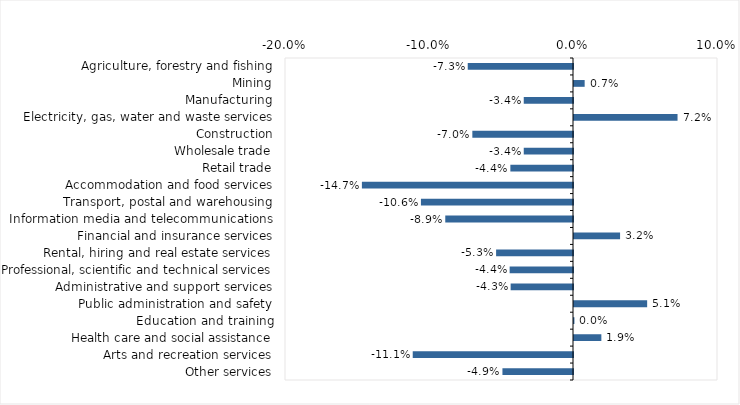
| Category | This week |
|---|---|
| Agriculture, forestry and fishing | -0.073 |
| Mining | 0.007 |
| Manufacturing | -0.034 |
| Electricity, gas, water and waste services | 0.072 |
| Construction | -0.07 |
| Wholesale trade | -0.034 |
| Retail trade | -0.044 |
| Accommodation and food services | -0.147 |
| Transport, postal and warehousing | -0.106 |
| Information media and telecommunications | -0.089 |
| Financial and insurance services | 0.032 |
| Rental, hiring and real estate services | -0.053 |
| Professional, scientific and technical services | -0.044 |
| Administrative and support services | -0.043 |
| Public administration and safety | 0.051 |
| Education and training | 0 |
| Health care and social assistance | 0.019 |
| Arts and recreation services | -0.111 |
| Other services | -0.049 |